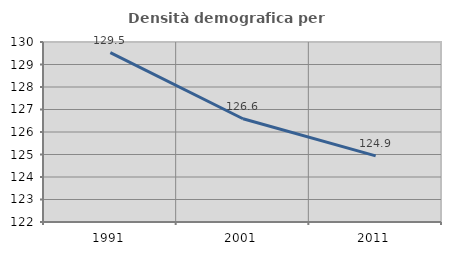
| Category | Densità demografica |
|---|---|
| 1991.0 | 129.53 |
| 2001.0 | 126.588 |
| 2011.0 | 124.939 |